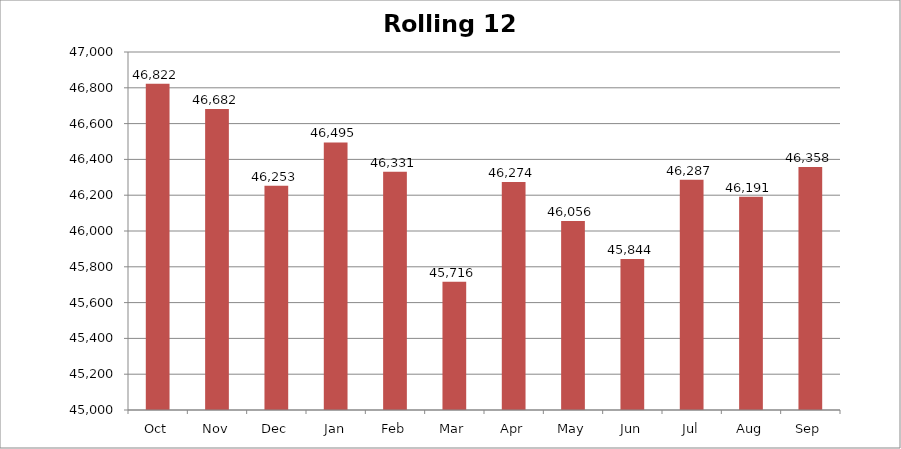
| Category | Rolling 12 Month |
|---|---|
| Oct | 46822 |
| Nov | 46682 |
| Dec | 46253 |
| Jan | 46495 |
| Feb | 46331 |
| Mar | 45716 |
| Apr | 46274 |
| May | 46056 |
| Jun | 45844 |
| Jul | 46287 |
| Aug | 46191 |
| Sep | 46358 |